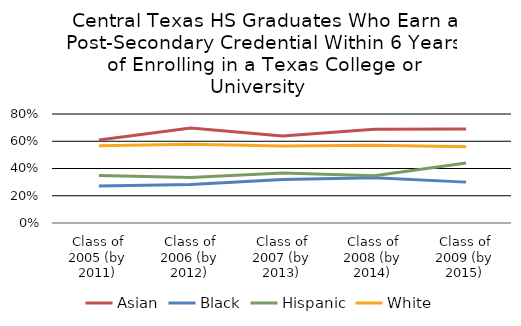
| Category | Asian | Black | Hispanic | White |
|---|---|---|---|---|
| Class of 2005 (by 2011) | 0.61 | 0.272 | 0.349 | 0.566 |
| Class of 2006 (by 2012) | 0.698 | 0.283 | 0.334 | 0.578 |
| Class of 2007 (by 2013) | 0.639 | 0.32 | 0.367 | 0.565 |
| Class of 2008 (by 2014) | 0.688 | 0.332 | 0.347 | 0.571 |
| Class of 2009 (by 2015) | 0.69 | 0.3 | 0.44 | 0.56 |